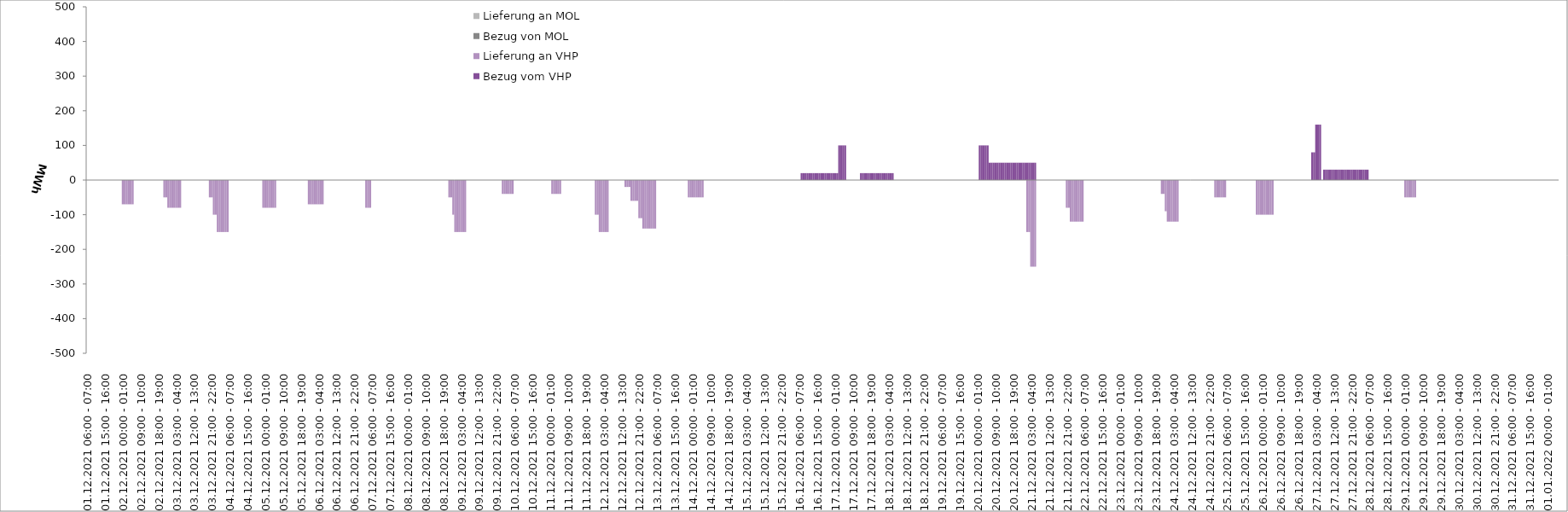
| Category | Bezug vom VHP | Lieferung an VHP | Bezug von MOL | Lieferung an MOL |
|---|---|---|---|---|
| 01.12.2021 06:00 - 07:00 | 0 | 0 | 0 | 0 |
| 01.12.2021 07:00 - 08:00 | 0 | 0 | 0 | 0 |
| 01.12.2021 08:00 - 09:00 | 0 | 0 | 0 | 0 |
| 01.12.2021 09:00 - 10:00 | 0 | 0 | 0 | 0 |
| 01.12.2021 10:00 - 11:00 | 0 | 0 | 0 | 0 |
| 01.12.2021 11:00 - 12:00 | 0 | 0 | 0 | 0 |
| 01.12.2021 12:00 - 13:00 | 0 | 0 | 0 | 0 |
| 01.12.2021 13:00 - 14:00 | 0 | 0 | 0 | 0 |
| 01.12.2021 14:00 - 15:00 | 0 | 0 | 0 | 0 |
| 01.12.2021 15:00 - 16:00 | 0 | 0 | 0 | 0 |
| 01.12.2021 16:00 - 17:00 | 0 | 0 | 0 | 0 |
| 01.12.2021 17:00 - 18:00 | 0 | 0 | 0 | 0 |
| 01.12.2021 18:00 - 19:00 | 0 | 0 | 0 | 0 |
| 01.12.2021 19:00 - 20:00 | 0 | 0 | 0 | 0 |
| 01.12.2021 20:00 - 21:00 | 0 | 0 | 0 | 0 |
| 01.12.2021 21:00 - 22:00 | 0 | 0 | 0 | 0 |
| 01.12.2021 22:00 - 23:00 | 0 | 0 | 0 | 0 |
| 01.12.2021 23:00 - 24:00 | 0 | 0 | 0 | 0 |
| 02.12.2021 00:00 - 01:00 | 0 | -70 | 0 | 0 |
| 02.12.2021 01:00 - 02:00 | 0 | -70 | 0 | 0 |
| 02.12.2021 02:00 - 03:00 | 0 | -70 | 0 | 0 |
| 02.12.2021 03:00 - 04:00 | 0 | -70 | 0 | 0 |
| 02.12.2021 04:00 - 05:00 | 0 | -70 | 0 | 0 |
| 02.12.2021 05:00 - 06:00 | 0 | -70 | 0 | 0 |
| 02.12.2021 06:00 - 07:00 | 0 | 0 | 0 | 0 |
| 02.12.2021 07:00 - 08:00 | 0 | 0 | 0 | 0 |
| 02.12.2021 08:00 - 09:00 | 0 | 0 | 0 | 0 |
| 02.12.2021 09:00 - 10:00 | 0 | 0 | 0 | 0 |
| 02.12.2021 10:00 - 11:00 | 0 | 0 | 0 | 0 |
| 02.12.2021 11:00 - 12:00 | 0 | 0 | 0 | 0 |
| 02.12.2021 12:00 - 13:00 | 0 | 0 | 0 | 0 |
| 02.12.2021 13:00 - 14:00 | 0 | 0 | 0 | 0 |
| 02.12.2021 14:00 - 15:00 | 0 | 0 | 0 | 0 |
| 02.12.2021 15:00 - 16:00 | 0 | 0 | 0 | 0 |
| 02.12.2021 16:00 - 17:00 | 0 | 0 | 0 | 0 |
| 02.12.2021 17:00 - 18:00 | 0 | 0 | 0 | 0 |
| 02.12.2021 18:00 - 19:00 | 0 | 0 | 0 | 0 |
| 02.12.2021 19:00 - 20:00 | 0 | 0 | 0 | 0 |
| 02.12.2021 20:00 - 21:00 | 0 | 0 | 0 | 0 |
| 02.12.2021 21:00 - 22:00 | 0 | -50 | 0 | 0 |
| 02.12.2021 22:00 - 23:00 | 0 | -50 | 0 | 0 |
| 02.12.2021 23:00 - 24:00 | 0 | -80 | 0 | 0 |
| 03.12.2021 00:00 - 01:00 | 0 | -80 | 0 | 0 |
| 03.12.2021 01:00 - 02:00 | 0 | -80 | 0 | 0 |
| 03.12.2021 02:00 - 03:00 | 0 | -80 | 0 | 0 |
| 03.12.2021 03:00 - 04:00 | 0 | -80 | 0 | 0 |
| 03.12.2021 04:00 - 05:00 | 0 | -80 | 0 | 0 |
| 03.12.2021 05:00 - 06:00 | 0 | -80 | 0 | 0 |
| 03.12.2021 06:00 - 07:00 | 0 | 0 | 0 | 0 |
| 03.12.2021 07:00 - 08:00 | 0 | 0 | 0 | 0 |
| 03.12.2021 08:00 - 09:00 | 0 | 0 | 0 | 0 |
| 03.12.2021 09:00 - 10:00 | 0 | 0 | 0 | 0 |
| 03.12.2021 10:00 - 11:00 | 0 | 0 | 0 | 0 |
| 03.12.2021 11:00 - 12:00 | 0 | 0 | 0 | 0 |
| 03.12.2021 12:00 - 13:00 | 0 | 0 | 0 | 0 |
| 03.12.2021 13:00 - 14:00 | 0 | 0 | 0 | 0 |
| 03.12.2021 14:00 - 15:00 | 0 | 0 | 0 | 0 |
| 03.12.2021 15:00 - 16:00 | 0 | 0 | 0 | 0 |
| 03.12.2021 16:00 - 17:00 | 0 | 0 | 0 | 0 |
| 03.12.2021 17:00 - 18:00 | 0 | 0 | 0 | 0 |
| 03.12.2021 18:00 - 19:00 | 0 | 0 | 0 | 0 |
| 03.12.2021 19:00 - 20:00 | 0 | 0 | 0 | 0 |
| 03.12.2021 20:00 - 21:00 | 0 | -50 | 0 | 0 |
| 03.12.2021 21:00 - 22:00 | 0 | -50 | 0 | 0 |
| 03.12.2021 22:00 - 23:00 | 0 | -100 | 0 | 0 |
| 03.12.2021 23:00 - 24:00 | 0 | -100 | 0 | 0 |
| 04.12.2021 00:00 - 01:00 | 0 | -150 | 0 | 0 |
| 04.12.2021 01:00 - 02:00 | 0 | -150 | 0 | 0 |
| 04.12.2021 02:00 - 03:00 | 0 | -150 | 0 | 0 |
| 04.12.2021 03:00 - 04:00 | 0 | -150 | 0 | 0 |
| 04.12.2021 04:00 - 05:00 | 0 | -150 | 0 | 0 |
| 04.12.2021 05:00 - 06:00 | 0 | -150 | 0 | 0 |
| 04.12.2021 06:00 - 07:00 | 0 | 0 | 0 | 0 |
| 04.12.2021 07:00 - 08:00 | 0 | 0 | 0 | 0 |
| 04.12.2021 08:00 - 09:00 | 0 | 0 | 0 | 0 |
| 04.12.2021 09:00 - 10:00 | 0 | 0 | 0 | 0 |
| 04.12.2021 10:00 - 11:00 | 0 | 0 | 0 | 0 |
| 04.12.2021 11:00 - 12:00 | 0 | 0 | 0 | 0 |
| 04.12.2021 12:00 - 13:00 | 0 | 0 | 0 | 0 |
| 04.12.2021 13:00 - 14:00 | 0 | 0 | 0 | 0 |
| 04.12.2021 14:00 - 15:00 | 0 | 0 | 0 | 0 |
| 04.12.2021 15:00 - 16:00 | 0 | 0 | 0 | 0 |
| 04.12.2021 16:00 - 17:00 | 0 | 0 | 0 | 0 |
| 04.12.2021 17:00 - 18:00 | 0 | 0 | 0 | 0 |
| 04.12.2021 18:00 - 19:00 | 0 | 0 | 0 | 0 |
| 04.12.2021 19:00 - 20:00 | 0 | 0 | 0 | 0 |
| 04.12.2021 20:00 - 21:00 | 0 | 0 | 0 | 0 |
| 04.12.2021 21:00 - 22:00 | 0 | 0 | 0 | 0 |
| 04.12.2021 22:00 - 23:00 | 0 | 0 | 0 | 0 |
| 04.12.2021 23:00 - 24:00 | 0 | -80 | 0 | 0 |
| 05.12.2021 00:00 - 01:00 | 0 | -80 | 0 | 0 |
| 05.12.2021 01:00 - 02:00 | 0 | -80 | 0 | 0 |
| 05.12.2021 02:00 - 03:00 | 0 | -80 | 0 | 0 |
| 05.12.2021 03:00 - 04:00 | 0 | -80 | 0 | 0 |
| 05.12.2021 04:00 - 05:00 | 0 | -80 | 0 | 0 |
| 05.12.2021 05:00 - 06:00 | 0 | -80 | 0 | 0 |
| 05.12.2021 06:00 - 07:00 | 0 | 0 | 0 | 0 |
| 05.12.2021 07:00 - 08:00 | 0 | 0 | 0 | 0 |
| 05.12.2021 08:00 - 09:00 | 0 | 0 | 0 | 0 |
| 05.12.2021 09:00 - 10:00 | 0 | 0 | 0 | 0 |
| 05.12.2021 10:00 - 11:00 | 0 | 0 | 0 | 0 |
| 05.12.2021 11:00 - 12:00 | 0 | 0 | 0 | 0 |
| 05.12.2021 12:00 - 13:00 | 0 | 0 | 0 | 0 |
| 05.12.2021 13:00 - 14:00 | 0 | 0 | 0 | 0 |
| 05.12.2021 14:00 - 15:00 | 0 | 0 | 0 | 0 |
| 05.12.2021 15:00 - 16:00 | 0 | 0 | 0 | 0 |
| 05.12.2021 16:00 - 17:00 | 0 | 0 | 0 | 0 |
| 05.12.2021 17:00 - 18:00 | 0 | 0 | 0 | 0 |
| 05.12.2021 18:00 - 19:00 | 0 | 0 | 0 | 0 |
| 05.12.2021 19:00 - 20:00 | 0 | 0 | 0 | 0 |
| 05.12.2021 20:00 - 21:00 | 0 | 0 | 0 | 0 |
| 05.12.2021 21:00 - 22:00 | 0 | 0 | 0 | 0 |
| 05.12.2021 22:00 - 23:00 | 0 | -70 | 0 | 0 |
| 05.12.2021 23:00 - 24:00 | 0 | -70 | 0 | 0 |
| 06.12.2021 00:00 - 01:00 | 0 | -70 | 0 | 0 |
| 06.12.2021 01:00 - 02:00 | 0 | -70 | 0 | 0 |
| 06.12.2021 02:00 - 03:00 | 0 | -70 | 0 | 0 |
| 06.12.2021 03:00 - 04:00 | 0 | -70 | 0 | 0 |
| 06.12.2021 04:00 - 05:00 | 0 | -70 | 0 | 0 |
| 06.12.2021 05:00 - 06:00 | 0 | -70 | 0 | 0 |
| 06.12.2021 06:00 - 07:00 | 0 | 0 | 0 | 0 |
| 06.12.2021 07:00 - 08:00 | 0 | 0 | 0 | 0 |
| 06.12.2021 08:00 - 09:00 | 0 | 0 | 0 | 0 |
| 06.12.2021 09:00 - 10:00 | 0 | 0 | 0 | 0 |
| 06.12.2021 10:00 - 11:00 | 0 | 0 | 0 | 0 |
| 06.12.2021 11:00 - 12:00 | 0 | 0 | 0 | 0 |
| 06.12.2021 12:00 - 13:00 | 0 | 0 | 0 | 0 |
| 06.12.2021 13:00 - 14:00 | 0 | 0 | 0 | 0 |
| 06.12.2021 14:00 - 15:00 | 0 | 0 | 0 | 0 |
| 06.12.2021 15:00 - 16:00 | 0 | 0 | 0 | 0 |
| 06.12.2021 16:00 - 17:00 | 0 | 0 | 0 | 0 |
| 06.12.2021 17:00 - 18:00 | 0 | 0 | 0 | 0 |
| 06.12.2021 18:00 - 19:00 | 0 | 0 | 0 | 0 |
| 06.12.2021 19:00 - 20:00 | 0 | 0 | 0 | 0 |
| 06.12.2021 20:00 - 21:00 | 0 | 0 | 0 | 0 |
| 06.12.2021 21:00 - 22:00 | 0 | 0 | 0 | 0 |
| 06.12.2021 22:00 - 23:00 | 0 | 0 | 0 | 0 |
| 06.12.2021 23:00 - 24:00 | 0 | 0 | 0 | 0 |
| 07.12.2021 00:00 - 01:00 | 0 | 0 | 0 | 0 |
| 07.12.2021 01:00 - 02:00 | 0 | 0 | 0 | 0 |
| 07.12.2021 02:00 - 03:00 | 0 | 0 | 0 | 0 |
| 07.12.2021 03:00 - 04:00 | 0 | -80 | 0 | 0 |
| 07.12.2021 04:00 - 05:00 | 0 | -80 | 0 | 0 |
| 07.12.2021 05:00 - 06:00 | 0 | -80 | 0 | 0 |
| 07.12.2021 06:00 - 07:00 | 0 | 0 | 0 | 0 |
| 07.12.2021 07:00 - 08:00 | 0 | 0 | 0 | 0 |
| 07.12.2021 08:00 - 09:00 | 0 | 0 | 0 | 0 |
| 07.12.2021 09:00 - 10:00 | 0 | 0 | 0 | 0 |
| 07.12.2021 10:00 - 11:00 | 0 | 0 | 0 | 0 |
| 07.12.2021 11:00 - 12:00 | 0 | 0 | 0 | 0 |
| 07.12.2021 12:00 - 13:00 | 0 | 0 | 0 | 0 |
| 07.12.2021 13:00 - 14:00 | 0 | 0 | 0 | 0 |
| 07.12.2021 14:00 - 15:00 | 0 | 0 | 0 | 0 |
| 07.12.2021 15:00 - 16:00 | 0 | 0 | 0 | 0 |
| 07.12.2021 16:00 - 17:00 | 0 | 0 | 0 | 0 |
| 07.12.2021 17:00 - 18:00 | 0 | 0 | 0 | 0 |
| 07.12.2021 18:00 - 19:00 | 0 | 0 | 0 | 0 |
| 07.12.2021 19:00 - 20:00 | 0 | 0 | 0 | 0 |
| 07.12.2021 20:00 - 21:00 | 0 | 0 | 0 | 0 |
| 07.12.2021 21:00 - 22:00 | 0 | 0 | 0 | 0 |
| 07.12.2021 22:00 - 23:00 | 0 | 0 | 0 | 0 |
| 07.12.2021 23:00 - 24:00 | 0 | 0 | 0 | 0 |
| 08.12.2021 00:00 - 01:00 | 0 | 0 | 0 | 0 |
| 08.12.2021 01:00 - 02:00 | 0 | 0 | 0 | 0 |
| 08.12.2021 02:00 - 03:00 | 0 | 0 | 0 | 0 |
| 08.12.2021 03:00 - 04:00 | 0 | 0 | 0 | 0 |
| 08.12.2021 04:00 - 05:00 | 0 | 0 | 0 | 0 |
| 08.12.2021 05:00 - 06:00 | 0 | 0 | 0 | 0 |
| 08.12.2021 06:00 - 07:00 | 0 | 0 | 0 | 0 |
| 08.12.2021 07:00 - 08:00 | 0 | 0 | 0 | 0 |
| 08.12.2021 08:00 - 09:00 | 0 | 0 | 0 | 0 |
| 08.12.2021 09:00 - 10:00 | 0 | 0 | 0 | 0 |
| 08.12.2021 10:00 - 11:00 | 0 | 0 | 0 | 0 |
| 08.12.2021 11:00 - 12:00 | 0 | 0 | 0 | 0 |
| 08.12.2021 12:00 - 13:00 | 0 | 0 | 0 | 0 |
| 08.12.2021 13:00 - 14:00 | 0 | 0 | 0 | 0 |
| 08.12.2021 14:00 - 15:00 | 0 | 0 | 0 | 0 |
| 08.12.2021 15:00 - 16:00 | 0 | 0 | 0 | 0 |
| 08.12.2021 16:00 - 17:00 | 0 | 0 | 0 | 0 |
| 08.12.2021 17:00 - 18:00 | 0 | 0 | 0 | 0 |
| 08.12.2021 18:00 - 19:00 | 0 | 0 | 0 | 0 |
| 08.12.2021 19:00 - 20:00 | 0 | 0 | 0 | 0 |
| 08.12.2021 20:00 - 21:00 | 0 | 0 | 0 | 0 |
| 08.12.2021 21:00 - 22:00 | 0 | -50 | 0 | 0 |
| 08.12.2021 22:00 - 23:00 | 0 | -50 | 0 | 0 |
| 08.12.2021 23:00 - 24:00 | 0 | -100 | 0 | 0 |
| 09.12.2021 00:00 - 01:00 | 0 | -150 | 0 | 0 |
| 09.12.2021 01:00 - 02:00 | 0 | -150 | 0 | 0 |
| 09.12.2021 02:00 - 03:00 | 0 | -150 | 0 | 0 |
| 09.12.2021 03:00 - 04:00 | 0 | -150 | 0 | 0 |
| 09.12.2021 04:00 - 05:00 | 0 | -150 | 0 | 0 |
| 09.12.2021 05:00 - 06:00 | 0 | -150 | 0 | 0 |
| 09.12.2021 06:00 - 07:00 | 0 | 0 | 0 | 0 |
| 09.12.2021 07:00 - 08:00 | 0 | 0 | 0 | 0 |
| 09.12.2021 08:00 - 09:00 | 0 | 0 | 0 | 0 |
| 09.12.2021 09:00 - 10:00 | 0 | 0 | 0 | 0 |
| 09.12.2021 10:00 - 11:00 | 0 | 0 | 0 | 0 |
| 09.12.2021 11:00 - 12:00 | 0 | 0 | 0 | 0 |
| 09.12.2021 12:00 - 13:00 | 0 | 0 | 0 | 0 |
| 09.12.2021 13:00 - 14:00 | 0 | 0 | 0 | 0 |
| 09.12.2021 14:00 - 15:00 | 0 | 0 | 0 | 0 |
| 09.12.2021 15:00 - 16:00 | 0 | 0 | 0 | 0 |
| 09.12.2021 16:00 - 17:00 | 0 | 0 | 0 | 0 |
| 09.12.2021 17:00 - 18:00 | 0 | 0 | 0 | 0 |
| 09.12.2021 18:00 - 19:00 | 0 | 0 | 0 | 0 |
| 09.12.2021 19:00 - 20:00 | 0 | 0 | 0 | 0 |
| 09.12.2021 20:00 - 21:00 | 0 | 0 | 0 | 0 |
| 09.12.2021 21:00 - 22:00 | 0 | 0 | 0 | 0 |
| 09.12.2021 22:00 - 23:00 | 0 | 0 | 0 | 0 |
| 09.12.2021 23:00 - 24:00 | 0 | 0 | 0 | 0 |
| 10.12.2021 00:00 - 01:00 | 0 | -40 | 0 | 0 |
| 10.12.2021 01:00 - 02:00 | 0 | -40 | 0 | 0 |
| 10.12.2021 02:00 - 03:00 | 0 | -40 | 0 | 0 |
| 10.12.2021 03:00 - 04:00 | 0 | -40 | 0 | 0 |
| 10.12.2021 04:00 - 05:00 | 0 | -40 | 0 | 0 |
| 10.12.2021 05:00 - 06:00 | 0 | -40 | 0 | 0 |
| 10.12.2021 06:00 - 07:00 | 0 | 0 | 0 | 0 |
| 10.12.2021 07:00 - 08:00 | 0 | 0 | 0 | 0 |
| 10.12.2021 08:00 - 09:00 | 0 | 0 | 0 | 0 |
| 10.12.2021 09:00 - 10:00 | 0 | 0 | 0 | 0 |
| 10.12.2021 10:00 - 11:00 | 0 | 0 | 0 | 0 |
| 10.12.2021 11:00 - 12:00 | 0 | 0 | 0 | 0 |
| 10.12.2021 12:00 - 13:00 | 0 | 0 | 0 | 0 |
| 10.12.2021 13:00 - 14:00 | 0 | 0 | 0 | 0 |
| 10.12.2021 14:00 - 15:00 | 0 | 0 | 0 | 0 |
| 10.12.2021 15:00 - 16:00 | 0 | 0 | 0 | 0 |
| 10.12.2021 16:00 - 17:00 | 0 | 0 | 0 | 0 |
| 10.12.2021 17:00 - 18:00 | 0 | 0 | 0 | 0 |
| 10.12.2021 18:00 - 19:00 | 0 | 0 | 0 | 0 |
| 10.12.2021 19:00 - 20:00 | 0 | 0 | 0 | 0 |
| 10.12.2021 20:00 - 21:00 | 0 | 0 | 0 | 0 |
| 10.12.2021 21:00 - 22:00 | 0 | 0 | 0 | 0 |
| 10.12.2021 22:00 - 23:00 | 0 | 0 | 0 | 0 |
| 10.12.2021 23:00 - 24:00 | 0 | 0 | 0 | 0 |
| 11.12.2021 00:00 - 01:00 | 0 | 0 | 0 | 0 |
| 11.12.2021 01:00 - 02:00 | 0 | -40 | 0 | 0 |
| 11.12.2021 02:00 - 03:00 | 0 | -40 | 0 | 0 |
| 11.12.2021 03:00 - 04:00 | 0 | -40 | 0 | 0 |
| 11.12.2021 04:00 - 05:00 | 0 | -40 | 0 | 0 |
| 11.12.2021 05:00 - 06:00 | 0 | -40 | 0 | 0 |
| 11.12.2021 06:00 - 07:00 | 0 | 0 | 0 | 0 |
| 11.12.2021 07:00 - 08:00 | 0 | 0 | 0 | 0 |
| 11.12.2021 08:00 - 09:00 | 0 | 0 | 0 | 0 |
| 11.12.2021 09:00 - 10:00 | 0 | 0 | 0 | 0 |
| 11.12.2021 10:00 - 11:00 | 0 | 0 | 0 | 0 |
| 11.12.2021 11:00 - 12:00 | 0 | 0 | 0 | 0 |
| 11.12.2021 12:00 - 13:00 | 0 | 0 | 0 | 0 |
| 11.12.2021 13:00 - 14:00 | 0 | 0 | 0 | 0 |
| 11.12.2021 14:00 - 15:00 | 0 | 0 | 0 | 0 |
| 11.12.2021 15:00 - 16:00 | 0 | 0 | 0 | 0 |
| 11.12.2021 16:00 - 17:00 | 0 | 0 | 0 | 0 |
| 11.12.2021 17:00 - 18:00 | 0 | 0 | 0 | 0 |
| 11.12.2021 18:00 - 19:00 | 0 | 0 | 0 | 0 |
| 11.12.2021 19:00 - 20:00 | 0 | 0 | 0 | 0 |
| 11.12.2021 20:00 - 21:00 | 0 | 0 | 0 | 0 |
| 11.12.2021 21:00 - 22:00 | 0 | 0 | 0 | 0 |
| 11.12.2021 22:00 - 23:00 | 0 | 0 | 0 | 0 |
| 11.12.2021 23:00 - 24:00 | 0 | -100 | 0 | 0 |
| 12.12.2021 00:00 - 01:00 | 0 | -100 | 0 | 0 |
| 12.12.2021 01:00 - 02:00 | 0 | -150 | 0 | 0 |
| 12.12.2021 02:00 - 03:00 | 0 | -150 | 0 | 0 |
| 12.12.2021 03:00 - 04:00 | 0 | -150 | 0 | 0 |
| 12.12.2021 04:00 - 05:00 | 0 | -150 | 0 | 0 |
| 12.12.2021 05:00 - 06:00 | 0 | -150 | 0 | 0 |
| 12.12.2021 06:00 - 07:00 | 0 | 0 | 0 | 0 |
| 12.12.2021 07:00 - 08:00 | 0 | 0 | 0 | 0 |
| 12.12.2021 08:00 - 09:00 | 0 | 0 | 0 | 0 |
| 12.12.2021 09:00 - 10:00 | 0 | 0 | 0 | 0 |
| 12.12.2021 10:00 - 11:00 | 0 | 0 | 0 | 0 |
| 12.12.2021 11:00 - 12:00 | 0 | 0 | 0 | 0 |
| 12.12.2021 12:00 - 13:00 | 0 | 0 | 0 | 0 |
| 12.12.2021 13:00 - 14:00 | 0 | 0 | 0 | 0 |
| 12.12.2021 14:00 - 15:00 | 0 | -20 | 0 | 0 |
| 12.12.2021 15:00 - 16:00 | 0 | -20 | 0 | 0 |
| 12.12.2021 16:00 - 17:00 | 0 | -20 | 0 | 0 |
| 12.12.2021 17:00 - 18:00 | 0 | -60 | 0 | 0 |
| 12.12.2021 18:00 - 19:00 | 0 | -60 | 0 | 0 |
| 12.12.2021 19:00 - 20:00 | 0 | -60 | 0 | 0 |
| 12.12.2021 20:00 - 21:00 | 0 | -60 | 0 | 0 |
| 12.12.2021 21:00 - 22:00 | 0 | -110 | 0 | 0 |
| 12.12.2021 22:00 - 23:00 | 0 | -110 | 0 | 0 |
| 12.12.2021 23:00 - 24:00 | 0 | -140 | 0 | 0 |
| 13.12.2021 00:00 - 01:00 | 0 | -140 | 0 | 0 |
| 13.12.2021 01:00 - 02:00 | 0 | -140 | 0 | 0 |
| 13.12.2021 02:00 - 03:00 | 0 | -140 | 0 | 0 |
| 13.12.2021 03:00 - 04:00 | 0 | -140 | 0 | 0 |
| 13.12.2021 04:00 - 05:00 | 0 | -140 | 0 | 0 |
| 13.12.2021 05:00 - 06:00 | 0 | -140 | 0 | 0 |
| 13.12.2021 06:00 - 07:00 | 0 | 0 | 0 | 0 |
| 13.12.2021 07:00 - 08:00 | 0 | 0 | 0 | 0 |
| 13.12.2021 08:00 - 09:00 | 0 | 0 | 0 | 0 |
| 13.12.2021 09:00 - 10:00 | 0 | 0 | 0 | 0 |
| 13.12.2021 10:00 - 11:00 | 0 | 0 | 0 | 0 |
| 13.12.2021 11:00 - 12:00 | 0 | 0 | 0 | 0 |
| 13.12.2021 12:00 - 13:00 | 0 | 0 | 0 | 0 |
| 13.12.2021 13:00 - 14:00 | 0 | 0 | 0 | 0 |
| 13.12.2021 14:00 - 15:00 | 0 | 0 | 0 | 0 |
| 13.12.2021 15:00 - 16:00 | 0 | 0 | 0 | 0 |
| 13.12.2021 16:00 - 17:00 | 0 | 0 | 0 | 0 |
| 13.12.2021 17:00 - 18:00 | 0 | 0 | 0 | 0 |
| 13.12.2021 18:00 - 19:00 | 0 | 0 | 0 | 0 |
| 13.12.2021 19:00 - 20:00 | 0 | 0 | 0 | 0 |
| 13.12.2021 20:00 - 21:00 | 0 | 0 | 0 | 0 |
| 13.12.2021 21:00 - 22:00 | 0 | 0 | 0 | 0 |
| 13.12.2021 22:00 - 23:00 | 0 | -50 | 0 | 0 |
| 13.12.2021 23:00 - 24:00 | 0 | -50 | 0 | 0 |
| 14.12.2021 00:00 - 01:00 | 0 | -50 | 0 | 0 |
| 14.12.2021 01:00 - 02:00 | 0 | -50 | 0 | 0 |
| 14.12.2021 02:00 - 03:00 | 0 | -50 | 0 | 0 |
| 14.12.2021 03:00 - 04:00 | 0 | -50 | 0 | 0 |
| 14.12.2021 04:00 - 05:00 | 0 | -50 | 0 | 0 |
| 14.12.2021 05:00 - 06:00 | 0 | -50 | 0 | 0 |
| 14.12.2021 06:00 - 07:00 | 0 | 0 | 0 | 0 |
| 14.12.2021 07:00 - 08:00 | 0 | 0 | 0 | 0 |
| 14.12.2021 08:00 - 09:00 | 0 | 0 | 0 | 0 |
| 14.12.2021 09:00 - 10:00 | 0 | 0 | 0 | 0 |
| 14.12.2021 10:00 - 11:00 | 0 | 0 | 0 | 0 |
| 14.12.2021 11:00 - 12:00 | 0 | 0 | 0 | 0 |
| 14.12.2021 12:00 - 13:00 | 0 | 0 | 0 | 0 |
| 14.12.2021 13:00 - 14:00 | 0 | 0 | 0 | 0 |
| 14.12.2021 14:00 - 15:00 | 0 | 0 | 0 | 0 |
| 14.12.2021 15:00 - 16:00 | 0 | 0 | 0 | 0 |
| 14.12.2021 16:00 - 17:00 | 0 | 0 | 0 | 0 |
| 14.12.2021 17:00 - 18:00 | 0 | 0 | 0 | 0 |
| 14.12.2021 18:00 - 19:00 | 0 | 0 | 0 | 0 |
| 14.12.2021 19:00 - 20:00 | 0 | 0 | 0 | 0 |
| 14.12.2021 20:00 - 21:00 | 0 | 0 | 0 | 0 |
| 14.12.2021 21:00 - 22:00 | 0 | 0 | 0 | 0 |
| 14.12.2021 22:00 - 23:00 | 0 | 0 | 0 | 0 |
| 14.12.2021 23:00 - 24:00 | 0 | 0 | 0 | 0 |
| 15.12.2021 00:00 - 01:00 | 0 | 0 | 0 | 0 |
| 15.12.2021 01:00 - 02:00 | 0 | 0 | 0 | 0 |
| 15.12.2021 02:00 - 03:00 | 0 | 0 | 0 | 0 |
| 15.12.2021 03:00 - 04:00 | 0 | 0 | 0 | 0 |
| 15.12.2021 04:00 - 05:00 | 0 | 0 | 0 | 0 |
| 15.12.2021 05:00 - 06:00 | 0 | 0 | 0 | 0 |
| 15.12.2021 06:00 - 07:00 | 0 | 0 | 0 | 0 |
| 15.12.2021 07:00 - 08:00 | 0 | 0 | 0 | 0 |
| 15.12.2021 08:00 - 09:00 | 0 | 0 | 0 | 0 |
| 15.12.2021 09:00 - 10:00 | 0 | 0 | 0 | 0 |
| 15.12.2021 10:00 - 11:00 | 0 | 0 | 0 | 0 |
| 15.12.2021 11:00 - 12:00 | 0 | 0 | 0 | 0 |
| 15.12.2021 12:00 - 13:00 | 0 | 0 | 0 | 0 |
| 15.12.2021 13:00 - 14:00 | 0 | 0 | 0 | 0 |
| 15.12.2021 14:00 - 15:00 | 0 | 0 | 0 | 0 |
| 15.12.2021 15:00 - 16:00 | 0 | 0 | 0 | 0 |
| 15.12.2021 16:00 - 17:00 | 0 | 0 | 0 | 0 |
| 15.12.2021 17:00 - 18:00 | 0 | 0 | 0 | 0 |
| 15.12.2021 18:00 - 19:00 | 0 | 0 | 0 | 0 |
| 15.12.2021 19:00 - 20:00 | 0 | 0 | 0 | 0 |
| 15.12.2021 20:00 - 21:00 | 0 | 0 | 0 | 0 |
| 15.12.2021 21:00 - 22:00 | 0 | 0 | 0 | 0 |
| 15.12.2021 22:00 - 23:00 | 0 | 0 | 0 | 0 |
| 15.12.2021 23:00 - 24:00 | 0 | 0 | 0 | 0 |
| 16.12.2021 00:00 - 01:00 | 0 | 0 | 0 | 0 |
| 16.12.2021 01:00 - 02:00 | 0 | 0 | 0 | 0 |
| 16.12.2021 02:00 - 03:00 | 0 | 0 | 0 | 0 |
| 16.12.2021 03:00 - 04:00 | 0 | 0 | 0 | 0 |
| 16.12.2021 04:00 - 05:00 | 0 | 0 | 0 | 0 |
| 16.12.2021 05:00 - 06:00 | 0 | 0 | 0 | 0 |
| 16.12.2021 06:00 - 07:00 | 0 | 0 | 0 | 0 |
| 16.12.2021 07:00 - 08:00 | 20 | 0 | 0 | 0 |
| 16.12.2021 08:00 - 09:00 | 20 | 0 | 0 | 0 |
| 16.12.2021 09:00 - 10:00 | 20 | 0 | 0 | 0 |
| 16.12.2021 10:00 - 11:00 | 20 | 0 | 0 | 0 |
| 16.12.2021 11:00 - 12:00 | 20 | 0 | 0 | 0 |
| 16.12.2021 12:00 - 13:00 | 20 | 0 | 0 | 0 |
| 16.12.2021 13:00 - 14:00 | 20 | 0 | 0 | 0 |
| 16.12.2021 14:00 - 15:00 | 20 | 0 | 0 | 0 |
| 16.12.2021 15:00 - 16:00 | 20 | 0 | 0 | 0 |
| 16.12.2021 16:00 - 17:00 | 20 | 0 | 0 | 0 |
| 16.12.2021 17:00 - 18:00 | 20 | 0 | 0 | 0 |
| 16.12.2021 18:00 - 19:00 | 20 | 0 | 0 | 0 |
| 16.12.2021 19:00 - 20:00 | 20 | 0 | 0 | 0 |
| 16.12.2021 20:00 - 21:00 | 20 | 0 | 0 | 0 |
| 16.12.2021 21:00 - 22:00 | 20 | 0 | 0 | 0 |
| 16.12.2021 22:00 - 23:00 | 20 | 0 | 0 | 0 |
| 16.12.2021 23:00 - 24:00 | 20 | 0 | 0 | 0 |
| 17.12.2021 00:00 - 01:00 | 20 | 0 | 0 | 0 |
| 17.12.2021 01:00 - 02:00 | 20 | 0 | 0 | 0 |
| 17.12.2021 02:00 - 03:00 | 100 | 0 | 0 | 0 |
| 17.12.2021 03:00 - 04:00 | 100 | 0 | 0 | 0 |
| 17.12.2021 04:00 - 05:00 | 100 | 0 | 0 | 0 |
| 17.12.2021 05:00 - 06:00 | 100 | 0 | 0 | 0 |
| 17.12.2021 06:00 - 07:00 | 0 | 0 | 0 | 0 |
| 17.12.2021 07:00 - 08:00 | 0 | 0 | 0 | 0 |
| 17.12.2021 08:00 - 09:00 | 0 | 0 | 0 | 0 |
| 17.12.2021 09:00 - 10:00 | 0 | 0 | 0 | 0 |
| 17.12.2021 10:00 - 11:00 | 0 | 0 | 0 | 0 |
| 17.12.2021 11:00 - 12:00 | 0 | 0 | 0 | 0 |
| 17.12.2021 12:00 - 13:00 | 0 | 0 | 0 | 0 |
| 17.12.2021 13:00 - 14:00 | 20 | 0 | 0 | 0 |
| 17.12.2021 14:00 - 15:00 | 20 | 0 | 0 | 0 |
| 17.12.2021 15:00 - 16:00 | 20 | 0 | 0 | 0 |
| 17.12.2021 16:00 - 17:00 | 20 | 0 | 0 | 0 |
| 17.12.2021 17:00 - 18:00 | 20 | 0 | 0 | 0 |
| 17.12.2021 18:00 - 19:00 | 20 | 0 | 0 | 0 |
| 17.12.2021 19:00 - 20:00 | 20 | 0 | 0 | 0 |
| 17.12.2021 20:00 - 21:00 | 20 | 0 | 0 | 0 |
| 17.12.2021 21:00 - 22:00 | 20 | 0 | 0 | 0 |
| 17.12.2021 22:00 - 23:00 | 20 | 0 | 0 | 0 |
| 17.12.2021 23:00 - 24:00 | 20 | 0 | 0 | 0 |
| 18.12.2021 00:00 - 01:00 | 20 | 0 | 0 | 0 |
| 18.12.2021 01:00 - 02:00 | 20 | 0 | 0 | 0 |
| 18.12.2021 02:00 - 03:00 | 20 | 0 | 0 | 0 |
| 18.12.2021 03:00 - 04:00 | 20 | 0 | 0 | 0 |
| 18.12.2021 04:00 - 05:00 | 20 | 0 | 0 | 0 |
| 18.12.2021 05:00 - 06:00 | 20 | 0 | 0 | 0 |
| 18.12.2021 06:00 - 07:00 | 0 | 0 | 0 | 0 |
| 18.12.2021 07:00 - 08:00 | 0 | 0 | 0 | 0 |
| 18.12.2021 08:00 - 09:00 | 0 | 0 | 0 | 0 |
| 18.12.2021 09:00 - 10:00 | 0 | 0 | 0 | 0 |
| 18.12.2021 10:00 - 11:00 | 0 | 0 | 0 | 0 |
| 18.12.2021 11:00 - 12:00 | 0 | 0 | 0 | 0 |
| 18.12.2021 12:00 - 13:00 | 0 | 0 | 0 | 0 |
| 18.12.2021 13:00 - 14:00 | 0 | 0 | 0 | 0 |
| 18.12.2021 14:00 - 15:00 | 0 | 0 | 0 | 0 |
| 18.12.2021 15:00 - 16:00 | 0 | 0 | 0 | 0 |
| 18.12.2021 16:00 - 17:00 | 0 | 0 | 0 | 0 |
| 18.12.2021 17:00 - 18:00 | 0 | 0 | 0 | 0 |
| 18.12.2021 18:00 - 19:00 | 0 | 0 | 0 | 0 |
| 18.12.2021 19:00 - 20:00 | 0 | 0 | 0 | 0 |
| 18.12.2021 20:00 - 21:00 | 0 | 0 | 0 | 0 |
| 18.12.2021 21:00 - 22:00 | 0 | 0 | 0 | 0 |
| 18.12.2021 22:00 - 23:00 | 0 | 0 | 0 | 0 |
| 18.12.2021 23:00 - 24:00 | 0 | 0 | 0 | 0 |
| 19.12.2021 00:00 - 01:00 | 0 | 0 | 0 | 0 |
| 19.12.2021 01:00 - 02:00 | 0 | 0 | 0 | 0 |
| 19.12.2021 02:00 - 03:00 | 0 | 0 | 0 | 0 |
| 19.12.2021 03:00 - 04:00 | 0 | 0 | 0 | 0 |
| 19.12.2021 04:00 - 05:00 | 0 | 0 | 0 | 0 |
| 19.12.2021 05:00 - 06:00 | 0 | 0 | 0 | 0 |
| 19.12.2021 06:00 - 07:00 | 0 | 0 | 0 | 0 |
| 19.12.2021 07:00 - 08:00 | 0 | 0 | 0 | 0 |
| 19.12.2021 08:00 - 09:00 | 0 | 0 | 0 | 0 |
| 19.12.2021 09:00 - 10:00 | 0 | 0 | 0 | 0 |
| 19.12.2021 10:00 - 11:00 | 0 | 0 | 0 | 0 |
| 19.12.2021 11:00 - 12:00 | 0 | 0 | 0 | 0 |
| 19.12.2021 12:00 - 13:00 | 0 | 0 | 0 | 0 |
| 19.12.2021 13:00 - 14:00 | 0 | 0 | 0 | 0 |
| 19.12.2021 14:00 - 15:00 | 0 | 0 | 0 | 0 |
| 19.12.2021 15:00 - 16:00 | 0 | 0 | 0 | 0 |
| 19.12.2021 16:00 - 17:00 | 0 | 0 | 0 | 0 |
| 19.12.2021 17:00 - 18:00 | 0 | 0 | 0 | 0 |
| 19.12.2021 18:00 - 19:00 | 0 | 0 | 0 | 0 |
| 19.12.2021 19:00 - 20:00 | 0 | 0 | 0 | 0 |
| 19.12.2021 20:00 - 21:00 | 0 | 0 | 0 | 0 |
| 19.12.2021 21:00 - 22:00 | 0 | 0 | 0 | 0 |
| 19.12.2021 22:00 - 23:00 | 0 | 0 | 0 | 0 |
| 19.12.2021 23:00 - 24:00 | 0 | 0 | 0 | 0 |
| 20.12.2021 00:00 - 01:00 | 0 | 0 | 0 | 0 |
| 20.12.2021 01:00 - 02:00 | 100 | 0 | 0 | 0 |
| 20.12.2021 02:00 - 03:00 | 100 | 0 | 0 | 0 |
| 20.12.2021 03:00 - 04:00 | 100 | 0 | 0 | 0 |
| 20.12.2021 04:00 - 05:00 | 100 | 0 | 0 | 0 |
| 20.12.2021 05:00 - 06:00 | 100 | 0 | 0 | 0 |
| 20.12.2021 06:00 - 07:00 | 50 | 0 | 0 | 0 |
| 20.12.2021 07:00 - 08:00 | 50 | 0 | 0 | 0 |
| 20.12.2021 08:00 - 09:00 | 50 | 0 | 0 | 0 |
| 20.12.2021 09:00 - 10:00 | 50 | 0 | 0 | 0 |
| 20.12.2021 10:00 - 11:00 | 50 | 0 | 0 | 0 |
| 20.12.2021 11:00 - 12:00 | 50 | 0 | 0 | 0 |
| 20.12.2021 12:00 - 13:00 | 50 | 0 | 0 | 0 |
| 20.12.2021 13:00 - 14:00 | 50 | 0 | 0 | 0 |
| 20.12.2021 14:00 - 15:00 | 50 | 0 | 0 | 0 |
| 20.12.2021 15:00 - 16:00 | 50 | 0 | 0 | 0 |
| 20.12.2021 16:00 - 17:00 | 50 | 0 | 0 | 0 |
| 20.12.2021 17:00 - 18:00 | 50 | 0 | 0 | 0 |
| 20.12.2021 18:00 - 19:00 | 50 | 0 | 0 | 0 |
| 20.12.2021 19:00 - 20:00 | 50 | 0 | 0 | 0 |
| 20.12.2021 20:00 - 21:00 | 50 | 0 | 0 | 0 |
| 20.12.2021 21:00 - 22:00 | 50 | 0 | 0 | 0 |
| 20.12.2021 22:00 - 23:00 | 50 | 0 | 0 | 0 |
| 20.12.2021 23:00 - 24:00 | 50 | 0 | 0 | 0 |
| 21.12.2021 00:00 - 01:00 | 50 | 0 | 0 | 0 |
| 21.12.2021 01:00 - 02:00 | 50 | -150 | 0 | 0 |
| 21.12.2021 02:00 - 03:00 | 50 | -150 | 0 | 0 |
| 21.12.2021 03:00 - 04:00 | 50 | -250 | 0 | 0 |
| 21.12.2021 04:00 - 05:00 | 50 | -250 | 0 | 0 |
| 21.12.2021 05:00 - 06:00 | 50 | -250 | 0 | 0 |
| 21.12.2021 06:00 - 07:00 | 0 | 0 | 0 | 0 |
| 21.12.2021 07:00 - 08:00 | 0 | 0 | 0 | 0 |
| 21.12.2021 08:00 - 09:00 | 0 | 0 | 0 | 0 |
| 21.12.2021 09:00 - 10:00 | 0 | 0 | 0 | 0 |
| 21.12.2021 10:00 - 11:00 | 0 | 0 | 0 | 0 |
| 21.12.2021 11:00 - 12:00 | 0 | 0 | 0 | 0 |
| 21.12.2021 12:00 - 13:00 | 0 | 0 | 0 | 0 |
| 21.12.2021 13:00 - 14:00 | 0 | 0 | 0 | 0 |
| 21.12.2021 14:00 - 15:00 | 0 | 0 | 0 | 0 |
| 21.12.2021 15:00 - 16:00 | 0 | 0 | 0 | 0 |
| 21.12.2021 16:00 - 17:00 | 0 | 0 | 0 | 0 |
| 21.12.2021 17:00 - 18:00 | 0 | 0 | 0 | 0 |
| 21.12.2021 18:00 - 19:00 | 0 | 0 | 0 | 0 |
| 21.12.2021 19:00 - 20:00 | 0 | 0 | 0 | 0 |
| 21.12.2021 20:00 - 21:00 | 0 | 0 | 0 | 0 |
| 21.12.2021 21:00 - 22:00 | 0 | -80 | 0 | 0 |
| 21.12.2021 22:00 - 23:00 | 0 | -80 | 0 | 0 |
| 21.12.2021 23:00 - 24:00 | 0 | -120 | 0 | 0 |
| 22.12.2021 00:00 - 01:00 | 0 | -120 | 0 | 0 |
| 22.12.2021 01:00 - 02:00 | 0 | -120 | 0 | 0 |
| 22.12.2021 02:00 - 03:00 | 0 | -120 | 0 | 0 |
| 22.12.2021 03:00 - 04:00 | 0 | -120 | 0 | 0 |
| 22.12.2021 04:00 - 05:00 | 0 | -120 | 0 | 0 |
| 22.12.2021 05:00 - 06:00 | 0 | -120 | 0 | 0 |
| 22.12.2021 06:00 - 07:00 | 0 | 0 | 0 | 0 |
| 22.12.2021 07:00 - 08:00 | 0 | 0 | 0 | 0 |
| 22.12.2021 08:00 - 09:00 | 0 | 0 | 0 | 0 |
| 22.12.2021 09:00 - 10:00 | 0 | 0 | 0 | 0 |
| 22.12.2021 10:00 - 11:00 | 0 | 0 | 0 | 0 |
| 22.12.2021 11:00 - 12:00 | 0 | 0 | 0 | 0 |
| 22.12.2021 12:00 - 13:00 | 0 | 0 | 0 | 0 |
| 22.12.2021 13:00 - 14:00 | 0 | 0 | 0 | 0 |
| 22.12.2021 14:00 - 15:00 | 0 | 0 | 0 | 0 |
| 22.12.2021 15:00 - 16:00 | 0 | 0 | 0 | 0 |
| 22.12.2021 16:00 - 17:00 | 0 | 0 | 0 | 0 |
| 22.12.2021 17:00 - 18:00 | 0 | 0 | 0 | 0 |
| 22.12.2021 18:00 - 19:00 | 0 | 0 | 0 | 0 |
| 22.12.2021 19:00 - 20:00 | 0 | 0 | 0 | 0 |
| 22.12.2021 20:00 - 21:00 | 0 | 0 | 0 | 0 |
| 22.12.2021 21:00 - 22:00 | 0 | 0 | 0 | 0 |
| 22.12.2021 22:00 - 23:00 | 0 | 0 | 0 | 0 |
| 22.12.2021 23:00 - 24:00 | 0 | 0 | 0 | 0 |
| 23.12.2021 00:00 - 01:00 | 0 | 0 | 0 | 0 |
| 23.12.2021 01:00 - 02:00 | 0 | 0 | 0 | 0 |
| 23.12.2021 02:00 - 03:00 | 0 | 0 | 0 | 0 |
| 23.12.2021 03:00 - 04:00 | 0 | 0 | 0 | 0 |
| 23.12.2021 04:00 - 05:00 | 0 | 0 | 0 | 0 |
| 23.12.2021 05:00 - 06:00 | 0 | 0 | 0 | 0 |
| 23.12.2021 06:00 - 07:00 | 0 | 0 | 0 | 0 |
| 23.12.2021 07:00 - 08:00 | 0 | 0 | 0 | 0 |
| 23.12.2021 08:00 - 09:00 | 0 | 0 | 0 | 0 |
| 23.12.2021 09:00 - 10:00 | 0 | 0 | 0 | 0 |
| 23.12.2021 10:00 - 11:00 | 0 | 0 | 0 | 0 |
| 23.12.2021 11:00 - 12:00 | 0 | 0 | 0 | 0 |
| 23.12.2021 12:00 - 13:00 | 0 | 0 | 0 | 0 |
| 23.12.2021 13:00 - 14:00 | 0 | 0 | 0 | 0 |
| 23.12.2021 14:00 - 15:00 | 0 | 0 | 0 | 0 |
| 23.12.2021 15:00 - 16:00 | 0 | 0 | 0 | 0 |
| 23.12.2021 16:00 - 17:00 | 0 | 0 | 0 | 0 |
| 23.12.2021 17:00 - 18:00 | 0 | 0 | 0 | 0 |
| 23.12.2021 18:00 - 19:00 | 0 | 0 | 0 | 0 |
| 23.12.2021 19:00 - 20:00 | 0 | 0 | 0 | 0 |
| 23.12.2021 20:00 - 21:00 | 0 | 0 | 0 | 0 |
| 23.12.2021 21:00 - 22:00 | 0 | -40 | 0 | 0 |
| 23.12.2021 22:00 - 23:00 | 0 | -40 | 0 | 0 |
| 23.12.2021 23:00 - 24:00 | 0 | -90 | 0 | 0 |
| 24.12.2021 00:00 - 01:00 | 0 | -120 | 0 | 0 |
| 24.12.2021 01:00 - 02:00 | 0 | -120 | 0 | 0 |
| 24.12.2021 02:00 - 03:00 | 0 | -120 | 0 | 0 |
| 24.12.2021 03:00 - 04:00 | 0 | -120 | 0 | 0 |
| 24.12.2021 04:00 - 05:00 | 0 | -120 | 0 | 0 |
| 24.12.2021 05:00 - 06:00 | 0 | -120 | 0 | 0 |
| 24.12.2021 06:00 - 07:00 | 0 | 0 | 0 | 0 |
| 24.12.2021 07:00 - 08:00 | 0 | 0 | 0 | 0 |
| 24.12.2021 08:00 - 09:00 | 0 | 0 | 0 | 0 |
| 24.12.2021 09:00 - 10:00 | 0 | 0 | 0 | 0 |
| 24.12.2021 10:00 - 11:00 | 0 | 0 | 0 | 0 |
| 24.12.2021 11:00 - 12:00 | 0 | 0 | 0 | 0 |
| 24.12.2021 12:00 - 13:00 | 0 | 0 | 0 | 0 |
| 24.12.2021 13:00 - 14:00 | 0 | 0 | 0 | 0 |
| 24.12.2021 14:00 - 15:00 | 0 | 0 | 0 | 0 |
| 24.12.2021 15:00 - 16:00 | 0 | 0 | 0 | 0 |
| 24.12.2021 16:00 - 17:00 | 0 | 0 | 0 | 0 |
| 24.12.2021 17:00 - 18:00 | 0 | 0 | 0 | 0 |
| 24.12.2021 18:00 - 19:00 | 0 | 0 | 0 | 0 |
| 24.12.2021 19:00 - 20:00 | 0 | 0 | 0 | 0 |
| 24.12.2021 20:00 - 21:00 | 0 | 0 | 0 | 0 |
| 24.12.2021 21:00 - 22:00 | 0 | 0 | 0 | 0 |
| 24.12.2021 22:00 - 23:00 | 0 | 0 | 0 | 0 |
| 24.12.2021 23:00 - 24:00 | 0 | 0 | 0 | 0 |
| 25.12.2021 00:00 - 01:00 | 0 | -50 | 0 | 0 |
| 25.12.2021 01:00 - 02:00 | 0 | -50 | 0 | 0 |
| 25.12.2021 02:00 - 03:00 | 0 | -50 | 0 | 0 |
| 25.12.2021 03:00 - 04:00 | 0 | -50 | 0 | 0 |
| 25.12.2021 04:00 - 05:00 | 0 | -50 | 0 | 0 |
| 25.12.2021 05:00 - 06:00 | 0 | -50 | 0 | 0 |
| 25.12.2021 06:00 - 07:00 | 0 | 0 | 0 | 0 |
| 25.12.2021 07:00 - 08:00 | 0 | 0 | 0 | 0 |
| 25.12.2021 08:00 - 09:00 | 0 | 0 | 0 | 0 |
| 25.12.2021 09:00 - 10:00 | 0 | 0 | 0 | 0 |
| 25.12.2021 10:00 - 11:00 | 0 | 0 | 0 | 0 |
| 25.12.2021 11:00 - 12:00 | 0 | 0 | 0 | 0 |
| 25.12.2021 12:00 - 13:00 | 0 | 0 | 0 | 0 |
| 25.12.2021 13:00 - 14:00 | 0 | 0 | 0 | 0 |
| 25.12.2021 14:00 - 15:00 | 0 | 0 | 0 | 0 |
| 25.12.2021 15:00 - 16:00 | 0 | 0 | 0 | 0 |
| 25.12.2021 16:00 - 17:00 | 0 | 0 | 0 | 0 |
| 25.12.2021 17:00 - 18:00 | 0 | 0 | 0 | 0 |
| 25.12.2021 18:00 - 19:00 | 0 | 0 | 0 | 0 |
| 25.12.2021 19:00 - 20:00 | 0 | 0 | 0 | 0 |
| 25.12.2021 20:00 - 21:00 | 0 | 0 | 0 | 0 |
| 25.12.2021 21:00 - 22:00 | 0 | -100 | 0 | 0 |
| 25.12.2021 22:00 - 23:00 | 0 | -100 | 0 | 0 |
| 25.12.2021 23:00 - 24:00 | 0 | -100 | 0 | 0 |
| 26.12.2021 00:00 - 01:00 | 0 | -100 | 0 | 0 |
| 26.12.2021 01:00 - 02:00 | 0 | -100 | 0 | 0 |
| 26.12.2021 02:00 - 03:00 | 0 | -100 | 0 | 0 |
| 26.12.2021 03:00 - 04:00 | 0 | -100 | 0 | 0 |
| 26.12.2021 04:00 - 05:00 | 0 | -100 | 0 | 0 |
| 26.12.2021 05:00 - 06:00 | 0 | -100 | 0 | 0 |
| 26.12.2021 06:00 - 07:00 | 0 | 0 | 0 | 0 |
| 26.12.2021 07:00 - 08:00 | 0 | 0 | 0 | 0 |
| 26.12.2021 08:00 - 09:00 | 0 | 0 | 0 | 0 |
| 26.12.2021 09:00 - 10:00 | 0 | 0 | 0 | 0 |
| 26.12.2021 10:00 - 11:00 | 0 | 0 | 0 | 0 |
| 26.12.2021 11:00 - 12:00 | 0 | 0 | 0 | 0 |
| 26.12.2021 12:00 - 13:00 | 0 | 0 | 0 | 0 |
| 26.12.2021 13:00 - 14:00 | 0 | 0 | 0 | 0 |
| 26.12.2021 14:00 - 15:00 | 0 | 0 | 0 | 0 |
| 26.12.2021 15:00 - 16:00 | 0 | 0 | 0 | 0 |
| 26.12.2021 16:00 - 17:00 | 0 | 0 | 0 | 0 |
| 26.12.2021 17:00 - 18:00 | 0 | 0 | 0 | 0 |
| 26.12.2021 18:00 - 19:00 | 0 | 0 | 0 | 0 |
| 26.12.2021 19:00 - 20:00 | 0 | 0 | 0 | 0 |
| 26.12.2021 20:00 - 21:00 | 0 | 0 | 0 | 0 |
| 26.12.2021 21:00 - 22:00 | 0 | 0 | 0 | 0 |
| 26.12.2021 22:00 - 23:00 | 0 | 0 | 0 | 0 |
| 26.12.2021 23:00 - 24:00 | 0 | 0 | 0 | 0 |
| 27.12.2021 00:00 - 01:00 | 0 | 0 | 0 | 0 |
| 27.12.2021 01:00 - 02:00 | 80 | 0 | 0 | 0 |
| 27.12.2021 02:00 - 03:00 | 80 | 0 | 0 | 0 |
| 27.12.2021 03:00 - 04:00 | 160 | 0 | 0 | 0 |
| 27.12.2021 04:00 - 05:00 | 160 | 0 | 0 | 0 |
| 27.12.2021 05:00 - 06:00 | 160 | 0 | 0 | 0 |
| 27.12.2021 06:00 - 07:00 | 0 | 0 | 0 | 0 |
| 27.12.2021 07:00 - 08:00 | 30 | 0 | 0 | 0 |
| 27.12.2021 08:00 - 09:00 | 30 | 0 | 0 | 0 |
| 27.12.2021 09:00 - 10:00 | 30 | 0 | 0 | 0 |
| 27.12.2021 10:00 - 11:00 | 30 | 0 | 0 | 0 |
| 27.12.2021 11:00 - 12:00 | 30 | 0 | 0 | 0 |
| 27.12.2021 12:00 - 13:00 | 30 | 0 | 0 | 0 |
| 27.12.2021 13:00 - 14:00 | 30 | 0 | 0 | 0 |
| 27.12.2021 14:00 - 15:00 | 30 | 0 | 0 | 0 |
| 27.12.2021 15:00 - 16:00 | 30 | 0 | 0 | 0 |
| 27.12.2021 16:00 - 17:00 | 30 | 0 | 0 | 0 |
| 27.12.2021 17:00 - 18:00 | 30 | 0 | 0 | 0 |
| 27.12.2021 18:00 - 19:00 | 30 | 0 | 0 | 0 |
| 27.12.2021 19:00 - 20:00 | 30 | 0 | 0 | 0 |
| 27.12.2021 20:00 - 21:00 | 30 | 0 | 0 | 0 |
| 27.12.2021 21:00 - 22:00 | 30 | 0 | 0 | 0 |
| 27.12.2021 22:00 - 23:00 | 30 | 0 | 0 | 0 |
| 27.12.2021 23:00 - 24:00 | 30 | 0 | 0 | 0 |
| 28.12.2021 00:00 - 01:00 | 30 | 0 | 0 | 0 |
| 28.12.2021 01:00 - 02:00 | 30 | 0 | 0 | 0 |
| 28.12.2021 02:00 - 03:00 | 30 | 0 | 0 | 0 |
| 28.12.2021 03:00 - 04:00 | 30 | 0 | 0 | 0 |
| 28.12.2021 04:00 - 05:00 | 30 | 0 | 0 | 0 |
| 28.12.2021 05:00 - 06:00 | 30 | 0 | 0 | 0 |
| 28.12.2021 06:00 - 07:00 | 0 | 0 | 0 | 0 |
| 28.12.2021 07:00 - 08:00 | 0 | 0 | 0 | 0 |
| 28.12.2021 08:00 - 09:00 | 0 | 0 | 0 | 0 |
| 28.12.2021 09:00 - 10:00 | 0 | 0 | 0 | 0 |
| 28.12.2021 10:00 - 11:00 | 0 | 0 | 0 | 0 |
| 28.12.2021 11:00 - 12:00 | 0 | 0 | 0 | 0 |
| 28.12.2021 12:00 - 13:00 | 0 | 0 | 0 | 0 |
| 28.12.2021 13:00 - 14:00 | 0 | 0 | 0 | 0 |
| 28.12.2021 14:00 - 15:00 | 0 | 0 | 0 | 0 |
| 28.12.2021 15:00 - 16:00 | 0 | 0 | 0 | 0 |
| 28.12.2021 16:00 - 17:00 | 0 | 0 | 0 | 0 |
| 28.12.2021 17:00 - 18:00 | 0 | 0 | 0 | 0 |
| 28.12.2021 18:00 - 19:00 | 0 | 0 | 0 | 0 |
| 28.12.2021 19:00 - 20:00 | 0 | 0 | 0 | 0 |
| 28.12.2021 20:00 - 21:00 | 0 | 0 | 0 | 0 |
| 28.12.2021 21:00 - 22:00 | 0 | 0 | 0 | 0 |
| 28.12.2021 22:00 - 23:00 | 0 | 0 | 0 | 0 |
| 28.12.2021 23:00 - 24:00 | 0 | 0 | 0 | 0 |
| 29.12.2021 00:00 - 01:00 | 0 | -50 | 0 | 0 |
| 29.12.2021 01:00 - 02:00 | 0 | -50 | 0 | 0 |
| 29.12.2021 02:00 - 03:00 | 0 | -50 | 0 | 0 |
| 29.12.2021 03:00 - 04:00 | 0 | -50 | 0 | 0 |
| 29.12.2021 04:00 - 05:00 | 0 | -50 | 0 | 0 |
| 29.12.2021 05:00 - 06:00 | 0 | -50 | 0 | 0 |
| 29.12.2021 06:00 - 07:00 | 0 | 0 | 0 | 0 |
| 29.12.2021 07:00 - 08:00 | 0 | 0 | 0 | 0 |
| 29.12.2021 08:00 - 09:00 | 0 | 0 | 0 | 0 |
| 29.12.2021 09:00 - 10:00 | 0 | 0 | 0 | 0 |
| 29.12.2021 10:00 - 11:00 | 0 | 0 | 0 | 0 |
| 29.12.2021 11:00 - 12:00 | 0 | 0 | 0 | 0 |
| 29.12.2021 12:00 - 13:00 | 0 | 0 | 0 | 0 |
| 29.12.2021 13:00 - 14:00 | 0 | 0 | 0 | 0 |
| 29.12.2021 14:00 - 15:00 | 0 | 0 | 0 | 0 |
| 29.12.2021 15:00 - 16:00 | 0 | 0 | 0 | 0 |
| 29.12.2021 16:00 - 17:00 | 0 | 0 | 0 | 0 |
| 29.12.2021 17:00 - 18:00 | 0 | 0 | 0 | 0 |
| 29.12.2021 18:00 - 19:00 | 0 | 0 | 0 | 0 |
| 29.12.2021 19:00 - 20:00 | 0 | 0 | 0 | 0 |
| 29.12.2021 20:00 - 21:00 | 0 | 0 | 0 | 0 |
| 29.12.2021 21:00 - 22:00 | 0 | 0 | 0 | 0 |
| 29.12.2021 22:00 - 23:00 | 0 | 0 | 0 | 0 |
| 29.12.2021 23:00 - 24:00 | 0 | 0 | 0 | 0 |
| 30.12.2021 00:00 - 01:00 | 0 | 0 | 0 | 0 |
| 30.12.2021 01:00 - 02:00 | 0 | 0 | 0 | 0 |
| 30.12.2021 02:00 - 03:00 | 0 | 0 | 0 | 0 |
| 30.12.2021 03:00 - 04:00 | 0 | 0 | 0 | 0 |
| 30.12.2021 04:00 - 05:00 | 0 | 0 | 0 | 0 |
| 30.12.2021 05:00 - 06:00 | 0 | 0 | 0 | 0 |
| 30.12.2021 06:00 - 07:00 | 0 | 0 | 0 | 0 |
| 30.12.2021 07:00 - 08:00 | 0 | 0 | 0 | 0 |
| 30.12.2021 08:00 - 09:00 | 0 | 0 | 0 | 0 |
| 30.12.2021 09:00 - 10:00 | 0 | 0 | 0 | 0 |
| 30.12.2021 10:00 - 11:00 | 0 | 0 | 0 | 0 |
| 30.12.2021 11:00 - 12:00 | 0 | 0 | 0 | 0 |
| 30.12.2021 12:00 - 13:00 | 0 | 0 | 0 | 0 |
| 30.12.2021 13:00 - 14:00 | 0 | 0 | 0 | 0 |
| 30.12.2021 14:00 - 15:00 | 0 | 0 | 0 | 0 |
| 30.12.2021 15:00 - 16:00 | 0 | 0 | 0 | 0 |
| 30.12.2021 16:00 - 17:00 | 0 | 0 | 0 | 0 |
| 30.12.2021 17:00 - 18:00 | 0 | 0 | 0 | 0 |
| 30.12.2021 18:00 - 19:00 | 0 | 0 | 0 | 0 |
| 30.12.2021 19:00 - 20:00 | 0 | 0 | 0 | 0 |
| 30.12.2021 20:00 - 21:00 | 0 | 0 | 0 | 0 |
| 30.12.2021 21:00 - 22:00 | 0 | 0 | 0 | 0 |
| 30.12.2021 22:00 - 23:00 | 0 | 0 | 0 | 0 |
| 30.12.2021 23:00 - 24:00 | 0 | 0 | 0 | 0 |
| 31.12.2021 00:00 - 01:00 | 0 | 0 | 0 | 0 |
| 31.12.2021 01:00 - 02:00 | 0 | 0 | 0 | 0 |
| 31.12.2021 02:00 - 03:00 | 0 | 0 | 0 | 0 |
| 31.12.2021 03:00 - 04:00 | 0 | 0 | 0 | 0 |
| 31.12.2021 04:00 - 05:00 | 0 | 0 | 0 | 0 |
| 31.12.2021 05:00 - 06:00 | 0 | 0 | 0 | 0 |
| 31.12.2021 06:00 - 07:00 | 0 | 0 | 0 | 0 |
| 31.12.2021 07:00 - 08:00 | 0 | 0 | 0 | 0 |
| 31.12.2021 08:00 - 09:00 | 0 | 0 | 0 | 0 |
| 31.12.2021 09:00 - 10:00 | 0 | 0 | 0 | 0 |
| 31.12.2021 10:00 - 11:00 | 0 | 0 | 0 | 0 |
| 31.12.2021 11:00 - 12:00 | 0 | 0 | 0 | 0 |
| 31.12.2021 12:00 - 13:00 | 0 | 0 | 0 | 0 |
| 31.12.2021 13:00 - 14:00 | 0 | 0 | 0 | 0 |
| 31.12.2021 14:00 - 15:00 | 0 | 0 | 0 | 0 |
| 31.12.2021 15:00 - 16:00 | 0 | 0 | 0 | 0 |
| 31.12.2021 16:00 - 17:00 | 0 | 0 | 0 | 0 |
| 31.12.2021 17:00 - 18:00 | 0 | 0 | 0 | 0 |
| 31.12.2021 18:00 - 19:00 | 0 | 0 | 0 | 0 |
| 31.12.2021 19:00 - 20:00 | 0 | 0 | 0 | 0 |
| 31.12.2021 20:00 - 21:00 | 0 | 0 | 0 | 0 |
| 31.12.2021 21:00 - 22:00 | 0 | 0 | 0 | 0 |
| 31.12.2021 22:00 - 23:00 | 0 | 0 | 0 | 0 |
| 31.12.2021 23:00 - 24:00 | 0 | 0 | 0 | 0 |
| 01.01.2022 00:00 - 01:00 | 0 | 0 | 0 | 0 |
| 01.01.2022 01:00 - 02:00 | 0 | 0 | 0 | 0 |
| 01.01.2022 02:00 - 03:00 | 0 | 0 | 0 | 0 |
| 01.01.2022 03:00 - 04:00 | 0 | 0 | 0 | 0 |
| 01.01.2022 04:00 - 05:00 | 0 | 0 | 0 | 0 |
| 01.01.2022 05:00 - 06:00 | 0 | 0 | 0 | 0 |